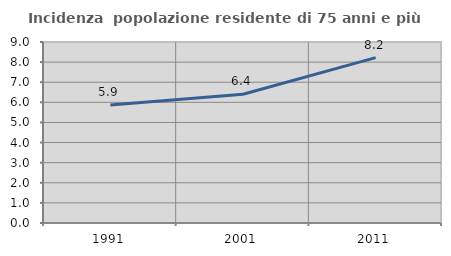
| Category | Incidenza  popolazione residente di 75 anni e più |
|---|---|
| 1991.0 | 5.87 |
| 2001.0 | 6.402 |
| 2011.0 | 8.221 |